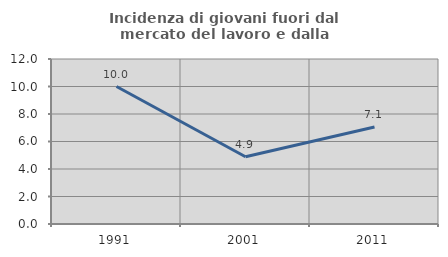
| Category | Incidenza di giovani fuori dal mercato del lavoro e dalla formazione  |
|---|---|
| 1991.0 | 10 |
| 2001.0 | 4.887 |
| 2011.0 | 7.059 |